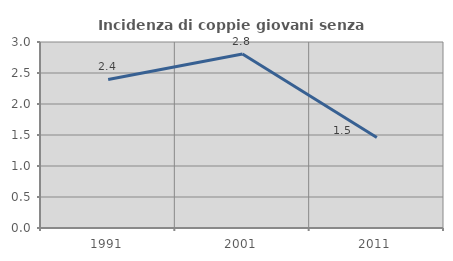
| Category | Incidenza di coppie giovani senza figli |
|---|---|
| 1991.0 | 2.396 |
| 2001.0 | 2.805 |
| 2011.0 | 1.459 |